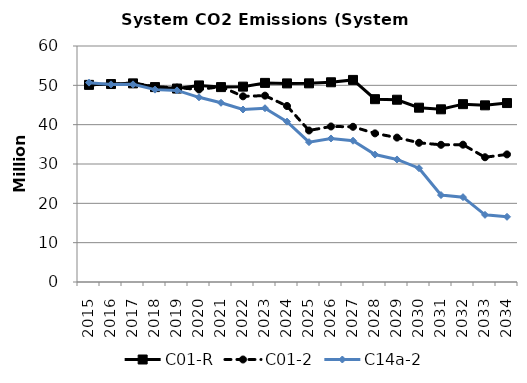
| Category | C01-R | C01-2 | C14a-2 |
|---|---|---|---|
| 2015.0 | 50.118 | 50.118 | 50.685 |
| 2016.0 | 50.329 | 50.238 | 50.242 |
| 2017.0 | 50.499 | 50.622 | 50.248 |
| 2018.0 | 49.555 | 49.636 | 48.908 |
| 2019.0 | 49.181 | 49.421 | 48.708 |
| 2020.0 | 49.976 | 48.938 | 46.954 |
| 2021.0 | 49.548 | 49.665 | 45.567 |
| 2022.0 | 49.671 | 47.203 | 43.854 |
| 2023.0 | 50.618 | 47.383 | 44.177 |
| 2024.0 | 50.491 | 44.746 | 40.775 |
| 2025.0 | 50.508 | 38.519 | 35.56 |
| 2026.0 | 50.777 | 39.539 | 36.493 |
| 2027.0 | 51.38 | 39.462 | 35.922 |
| 2028.0 | 46.481 | 37.785 | 32.393 |
| 2029.0 | 46.342 | 36.715 | 31.158 |
| 2030.0 | 44.317 | 35.397 | 28.931 |
| 2031.0 | 43.901 | 34.881 | 22.1 |
| 2032.0 | 45.215 | 34.915 | 21.57 |
| 2033.0 | 44.915 | 31.713 | 17.075 |
| 2034.0 | 45.496 | 32.435 | 16.572 |